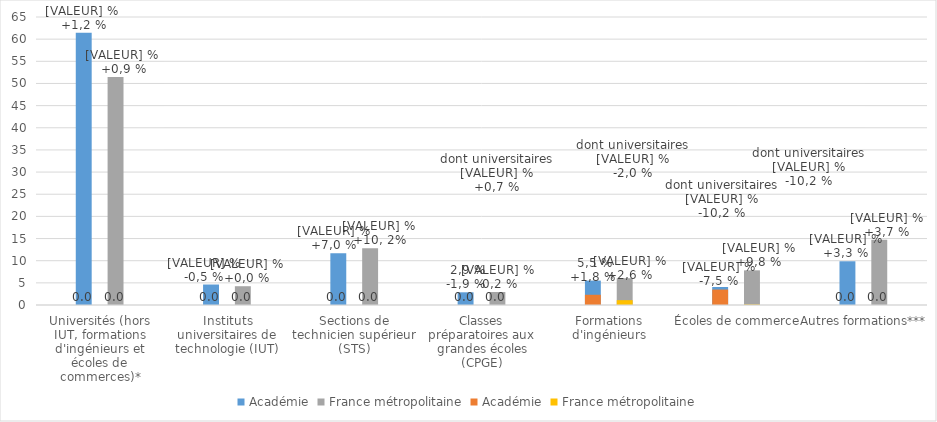
| Category | Académie | France métropolitaine |
|---|---|---|
| Universités (hors IUT, formations d'ingénieurs et écoles de commerces)* | 61.419 | 51.44 |
| Instituts universitaires de technologie (IUT) | 4.622 | 4.239 |
| Sections de technicien supérieur (STS) | 11.658 | 12.802 |
| Classes préparatoires aux grandes écoles (CPGE) | 2.865 | 2.929 |
| Formations d'ingénieurs | 5.507 | 6.045 |
| Écoles de commerce | 4.059 | 7.82 |
| Autres formations*** | 9.869 | 14.726 |